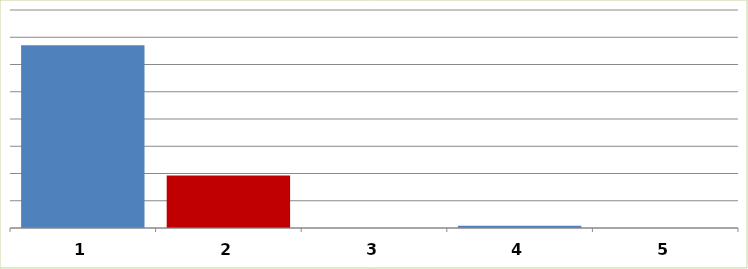
| Category | Series 0 |
|---|---|
| 0 | 33551480 |
| 1 | 9636083 |
| 2 | 0 |
| 3 | 427928 |
| 4 | 0 |